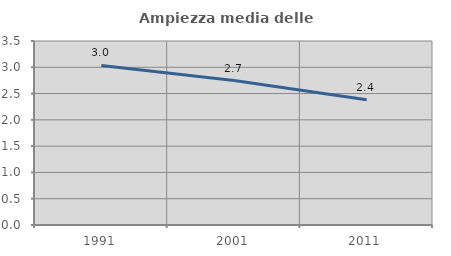
| Category | Ampiezza media delle famiglie |
|---|---|
| 1991.0 | 3.036 |
| 2001.0 | 2.748 |
| 2011.0 | 2.384 |